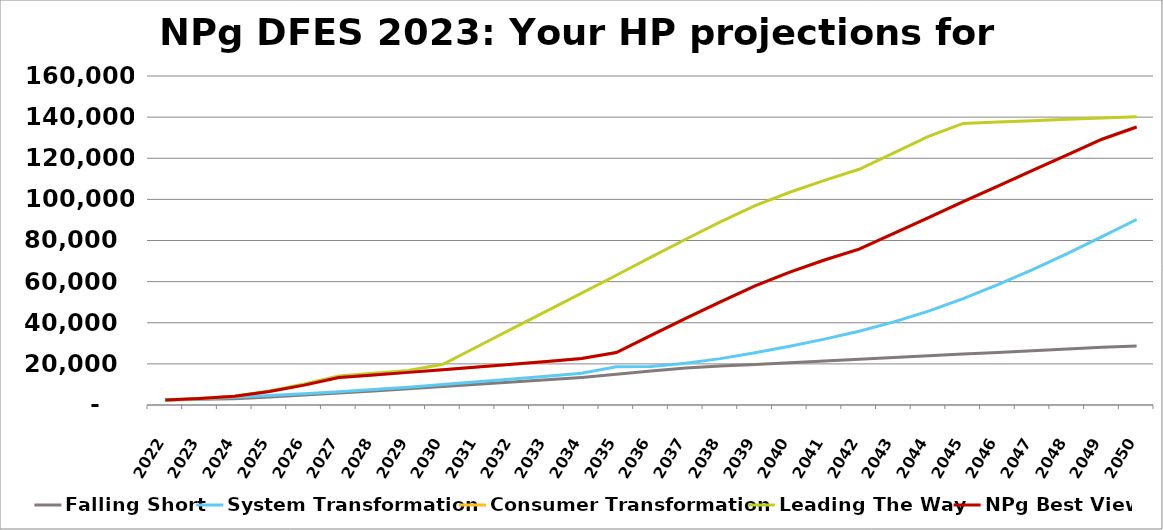
| Category | Falling Short | System Transformation | Consumer Transformation | Leading The Way | NPg Best View |
|---|---|---|---|---|---|
| 2022.0 | 2376 | 2376 | 2376 | 2376 | 2376 |
| 2023.0 | 2853 | 2918 | 3126 | 3114 | 3126 |
| 2024.0 | 3088 | 3722 | 4249 | 4281 | 4249 |
| 2025.0 | 3922 | 4578 | 6559 | 6861 | 6559 |
| 2026.0 | 4828 | 5464 | 9652 | 10236 | 9652 |
| 2027.0 | 5799 | 6423 | 13320 | 14086 | 13320 |
| 2028.0 | 6813 | 7505 | 14574 | 15385 | 14574 |
| 2029.0 | 7867 | 8670 | 15866 | 16731 | 15866 |
| 2030.0 | 8949 | 9989 | 17185 | 19776 | 17185 |
| 2031.0 | 10041 | 11323 | 18520 | 28440 | 18520 |
| 2032.0 | 11139 | 12672 | 19865 | 37133 | 19865 |
| 2033.0 | 12222 | 14005 | 21199 | 45794 | 21199 |
| 2034.0 | 13406 | 15407 | 22590 | 54445 | 22590 |
| 2035.0 | 14924 | 18606 | 25492 | 63107 | 25492 |
| 2036.0 | 16553 | 18724 | 33822 | 71932 | 33822 |
| 2037.0 | 18021 | 20250 | 42128 | 80622 | 42128 |
| 2038.0 | 18922 | 22557 | 50180 | 89032 | 50180 |
| 2039.0 | 19754 | 25398 | 57902 | 96926 | 57902 |
| 2040.0 | 20588 | 28606 | 64610 | 103456 | 64610 |
| 2041.0 | 21416 | 32038 | 70527 | 109258 | 70527 |
| 2042.0 | 22253 | 35879 | 75766 | 114649 | 75766 |
| 2043.0 | 23084 | 40416 | 83467 | 122640 | 83467 |
| 2044.0 | 23913 | 45682 | 91167 | 130627 | 91167 |
| 2045.0 | 24744 | 51738 | 98861 | 136924 | 98861 |
| 2046.0 | 25580 | 58559 | 106470 | 137595 | 106470 |
| 2047.0 | 26419 | 65845 | 114059 | 138263 | 114059 |
| 2048.0 | 27256 | 73614 | 121645 | 138928 | 121645 |
| 2049.0 | 28039 | 81913 | 129238 | 139591 | 129238 |
| 2050.0 | 28637 | 90208 | 135190 | 140195 | 135190 |